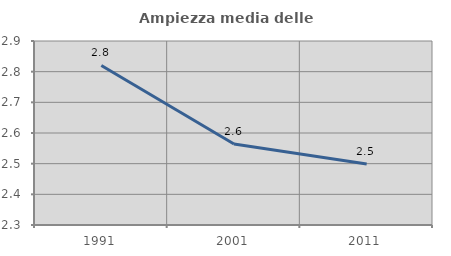
| Category | Ampiezza media delle famiglie |
|---|---|
| 1991.0 | 2.82 |
| 2001.0 | 2.564 |
| 2011.0 | 2.499 |